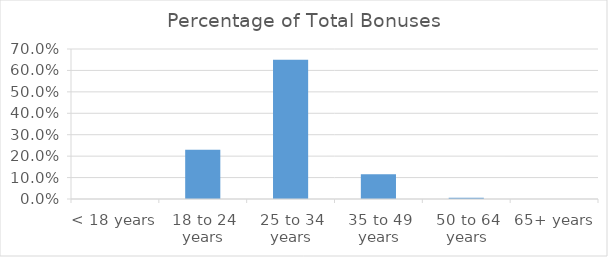
| Category | Percentage of Total Bonuses (%) |
|---|---|
| < 18 years | 0 |
| 18 to 24 years | 0.23 |
| 25 to 34 years | 0.65 |
| 35 to 49 years | 0.115 |
| 50 to 64 years | 0.006 |
| 65+ years | 0 |